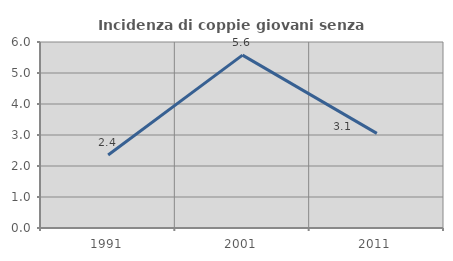
| Category | Incidenza di coppie giovani senza figli |
|---|---|
| 1991.0 | 2.355 |
| 2001.0 | 5.576 |
| 2011.0 | 3.053 |